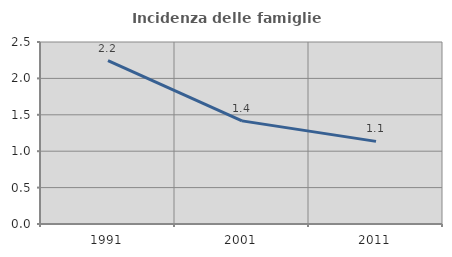
| Category | Incidenza delle famiglie numerose |
|---|---|
| 1991.0 | 2.244 |
| 2001.0 | 1.417 |
| 2011.0 | 1.135 |